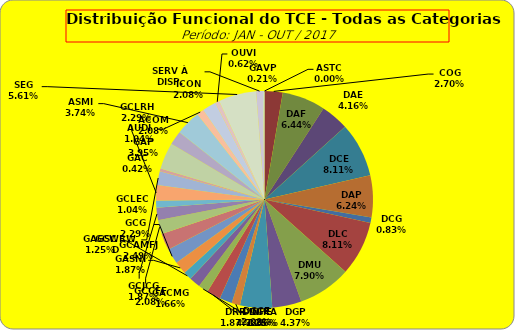
| Category | ASTC |
|---|---|
| ASTC | 0 |
| COG | 13 |
| DAF | 31 |
| DAE | 20 |
| DCE | 39 |
| DAP | 30 |
| DCG | 4 |
| DLC | 39 |
| DMU | 38 |
| DGP | 21 |
| DIN | 23 |
| DPE | 6 |
| DRR | 9 |
| DGCE | 10 |
| DGPA | 7 |
| GACMG | 8 |
| GAGSC | 6 |
| GASNI | 9 |
| GCG | 11 |
| GCAMFJ | 12 |
| GCCFF | 10 |
| GCJCG | 9 |
| GCLEC | 5 |
| GCLRH | 11 |
| GCWRWD | 10 |
| GAC | 2 |
| GAP | 19 |
| ACOM | 10 |
| ASMI | 18 |
| AUDI | 5 |
| ICON | 10 |
| OUVI | 3 |
| SEG | 27 |
| SERV À DISP. | 5 |
| GAVP | 1 |